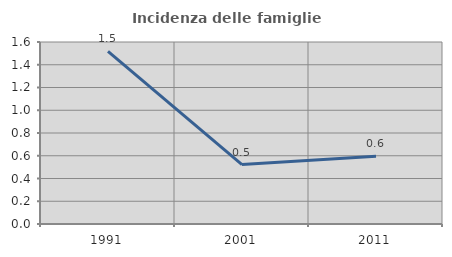
| Category | Incidenza delle famiglie numerose |
|---|---|
| 1991.0 | 1.517 |
| 2001.0 | 0.522 |
| 2011.0 | 0.596 |